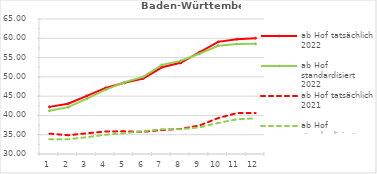
| Category | ab Hof tatsächlich 2022 | ab Hof standardisiert 2022 | ab Hof tatsächlich 2021 | ab Hof standardisiert 2021 |
|---|---|---|---|---|
| 0 | 42.22 | 41.207 | 35.278 | 33.842 |
| 1 | 43.047 | 42.148 | 34.871 | 33.816 |
| 2 | 45.063 | 44.366 | 35.366 | 34.36 |
| 3 | 47.126 | 46.685 | 35.853 | 35.002 |
| 4 | 48.462 | 48.608 | 35.876 | 35.367 |
| 5 | 49.556 | 49.977 | 35.753 | 35.938 |
| 6 | 52.486 | 53.116 | 36.2 | 36.416 |
| 7 | 53.634 | 54.141 | 36.504 | 36.44 |
| 8 | 56.371 | 55.995 | 37.389 | 36.896 |
| 9 | 59.072 | 58.074 | 39.305 | 38.049 |
| 10 | 59.765 | 58.488 | 40.612 | 38.987 |
| 11 | 60.03 | 58.566 | 40.609 | 39.26 |